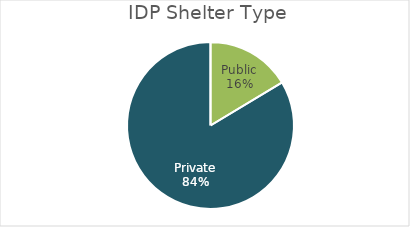
| Category | Series 0 |
|---|---|
| Public | 0.164 |
| Private | 0.836 |